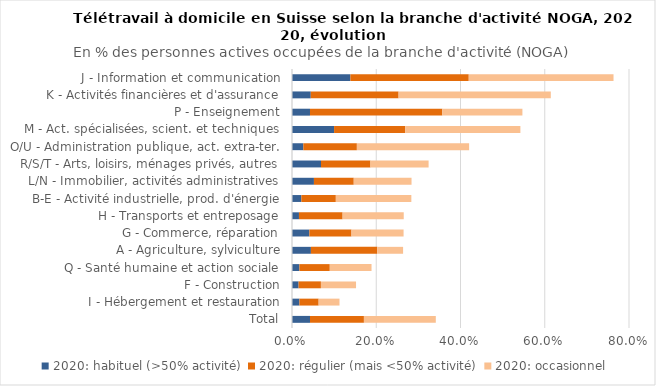
| Category | 2020: habituel (>50% activité) | 2020: régulier (mais <50% activité) | 2020: occasionnel  |
|---|---|---|---|
| Total | 0.043 | 0.128 | 0.171 |
| I - Hébergement et restauration | 0.018 | 0.046 | 0.05 |
| F - Construction | 0.016 | 0.053 | 0.083 |
| Q - Santé humaine et action sociale | 0.018 | 0.072 | 0.099 |
| A - Agriculture, sylviculture | 0.045 | 0.157 | 0.061 |
| G - Commerce, réparation | 0.041 | 0.1 | 0.124 |
| H - Transports et entreposage | 0.017 | 0.104 | 0.145 |
| B-E - Activité industrielle, prod. d'énergie | 0.022 | 0.082 | 0.179 |
| L/N - Immobilier, activités administratives | 0.052 | 0.095 | 0.137 |
| R/S/T - Arts, loisirs, ménages privés, autres | 0.069 | 0.117 | 0.138 |
| O/U - Administration publique, act. extra-ter. | 0.027 | 0.127 | 0.266 |
| M - Act. spécialisées, scient. et techniques | 0.1 | 0.169 | 0.273 |
| P - Enseignement | 0.043 | 0.314 | 0.19 |
| K - Activités financières et d'assurance | 0.045 | 0.208 | 0.361 |
| J - Information et communication | 0.139 | 0.281 | 0.344 |